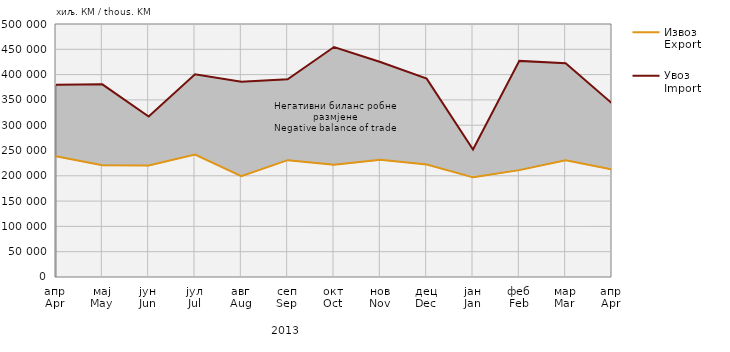
| Category | Извоз
Export | Увоз
Import |
|---|---|---|
| апр
Apr | 238435 | 379748 |
| мај
May | 220764 | 380770 |
| јун
Jun | 220173 | 317176 |
| јул
Jul | 242098 | 400481 |
| авг
Aug | 199427 | 385911 |
| сеп
Sep | 230912 | 390579 |
| окт
Oct | 221870 | 454480 |
| нов
Nov | 231500 | 424992 |
| дец
Dec | 222497 | 391993 |
| јан
Jan | 196950 | 251909 |
| феб
Feb | 211216 | 427092 |
| мар
Mar | 230811 | 422317 |
| апр
Apr | 212428 | 343153 |